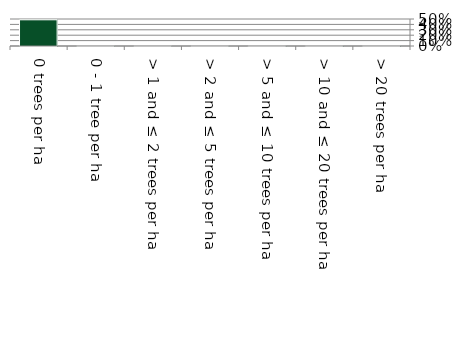
| Category | Non native |
|---|---|
| 0 trees per ha | 0.485 |
| 0 - 1 tree per ha | 0 |
| > 1 and ≤ 2 trees per ha | 0 |
| > 2 and ≤ 5 trees per ha | 0 |
| > 5 and ≤ 10 trees per ha | 0 |
| > 10 and ≤ 20 trees per ha | 0 |
| > 20 trees per ha | 0 |